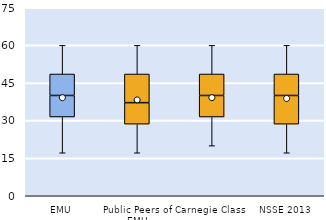
| Category | 25th | 50th | 75th |
|---|---|---|---|
| EMU | 31.429 | 8.571 | 8.571 |
| Public Peers of EMU | 28.571 | 8.571 | 11.429 |
| Carnegie Class | 31.429 | 8.571 | 8.571 |
| NSSE 2013 | 28.571 | 11.429 | 8.571 |